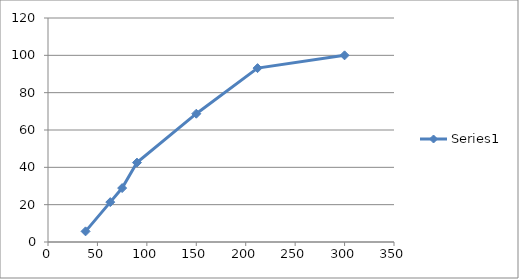
| Category | Series 0 |
|---|---|
| 300.0 | 100 |
| 212.0 | 93.154 |
| 150.0 | 68.724 |
| 90.0 | 42.531 |
| 75.0 | 28.89 |
| 63.0 | 21.369 |
| 38.0 | 5.705 |